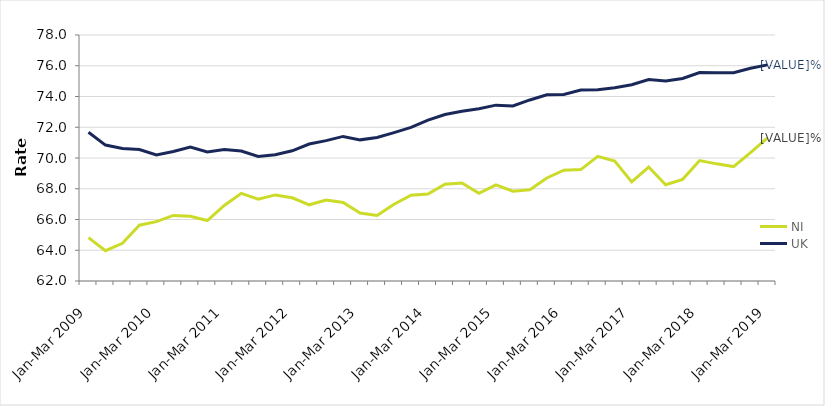
| Category | NI | UK |
|---|---|---|
| Jan-Mar 2009 | 64.822 | 71.673 |
| Apr-Jun 2009 | 63.973 | 70.84 |
| Jul-Sep 2009 | 64.453 | 70.617 |
| Oct-Dec 2009 | 65.629 | 70.552 |
| Jan-Mar 2010 | 65.858 | 70.195 |
| Apr-Jun 2010 | 66.264 | 70.423 |
| Jul-Sep 2010 | 66.205 | 70.705 |
| Oct-Dec 2010 | 65.931 | 70.39 |
| Jan-Mar 2011 | 66.913 | 70.546 |
| Apr-Jun 2011 | 67.699 | 70.45 |
| Jul-Sep 2011 | 67.317 | 70.105 |
| Oct-Dec 2011 | 67.599 | 70.218 |
| Jan-Mar 2012 | 67.412 | 70.467 |
| Apr-Jun 2012 | 66.955 | 70.908 |
| Jul-Sep 2012 | 67.271 | 71.131 |
| Oct-Dec 2012 | 67.111 | 71.404 |
| Jan-Mar 2013 | 66.421 | 71.18 |
| Apr-Jun 2013 | 66.259 | 71.332 |
| Jul-Sep 2013 | 66.99 | 71.654 |
| Oct-Dec 2013 | 67.584 | 71.994 |
| Jan-Mar 2014 | 67.657 | 72.46 |
| Apr-Jun 2014 | 68.296 | 72.83 |
| Jul-Sep 2014 | 68.375 | 73.043 |
| Oct-Dec 2014 | 67.708 | 73.203 |
| Jan-Mar 2015 | 68.249 | 73.437 |
| Apr-Jun 2015 | 67.839 | 73.383 |
| Jul-Sep 2015 | 67.93 | 73.776 |
| Oct-Dec 2015 | 68.699 | 74.112 |
| Jan-Mar 2016 | 69.205 | 74.135 |
| Apr-Jun 2016 | 69.246 | 74.417 |
| Jul-Sep 2016 | 70.107 | 74.447 |
| Oct-Dec 2016 | 69.8 | 74.566 |
| Jan-Mar 2017 | 68.449 | 74.769 |
| Apr-Jun 2017 | 69.411 | 75.104 |
| Jul-Sep 2017 | 68.262 | 75.007 |
| Oct-Dec 2017 | 68.61 | 75.175 |
| Jan-Mar 2018 | 69.833 | 75.561 |
| Apr-Jun 2018 | 69.62 | 75.549 |
| Jul-Sep 2018 | 69.441 | 75.553 |
| Oct-Dec 2018 | 70.349 | 75.833 |
| Jan-Mar 2019 | 71.307 | 76.057 |